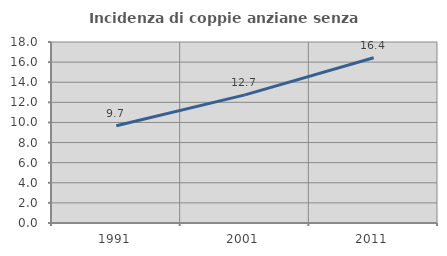
| Category | Incidenza di coppie anziane senza figli  |
|---|---|
| 1991.0 | 9.663 |
| 2001.0 | 12.745 |
| 2011.0 | 16.436 |